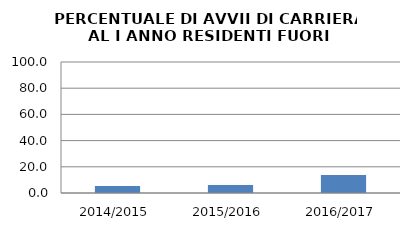
| Category | 2014/2015 2015/2016 2016/2017 |
|---|---|
| 2014/2015 | 5.263 |
| 2015/2016 | 6.186 |
| 2016/2017 | 13.793 |